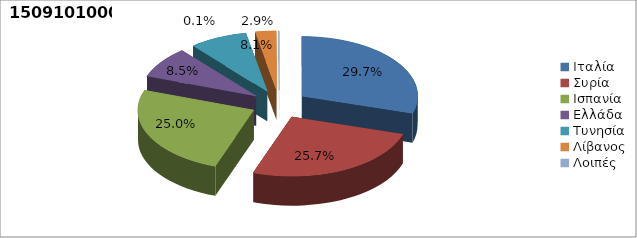
| Category | Series 0 |
|---|---|
| Ιταλία | 0.297 |
| Συρία | 0.257 |
| Ισπανία | 0.25 |
| Ελλάδα | 0.085 |
| Τυνησία | 0.081 |
| Λίβανος | 0.029 |
| Λοιπές | 0.001 |